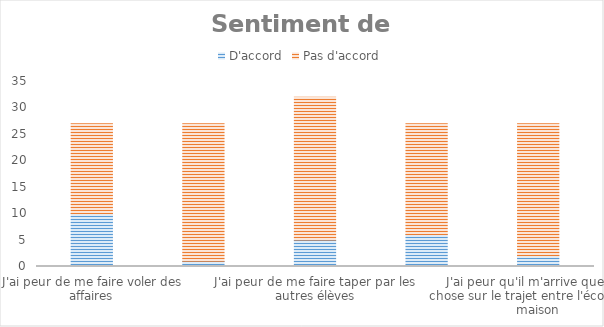
| Category | D'accord | Pas d'accord |
|---|---|---|
| J'ai peur de me faire voler des affaires | 10 | 17 |
| J'ai peur quand je suis à l'école | 1 | 26 |
| J'ai peur de me faire taper par les autres élèves | 5 | 27 |
| J'ai peur que des inconnus entrent dans l'école pour m'embêter | 6 | 21 |
| J'ai peur qu'il m'arrive quelque chose sur le trajet entre l'école et la maison | 2 | 25 |